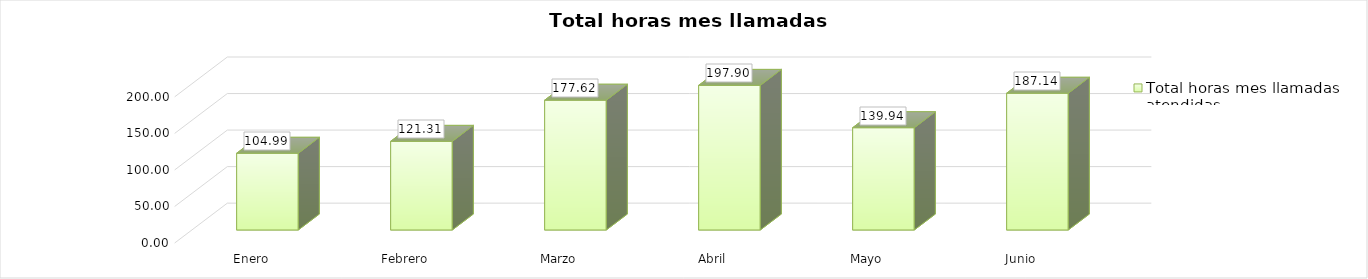
| Category | Total horas mes llamadas atendidas |
|---|---|
| Enero | 104.99 |
| Febrero | 121.31 |
| Marzo | 177.62 |
| Abril | 197.9 |
| Mayo | 139.94 |
| Junio | 187.14 |